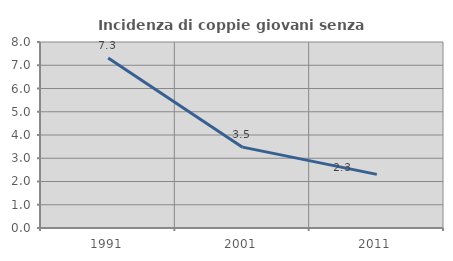
| Category | Incidenza di coppie giovani senza figli |
|---|---|
| 1991.0 | 7.317 |
| 2001.0 | 3.478 |
| 2011.0 | 2.305 |